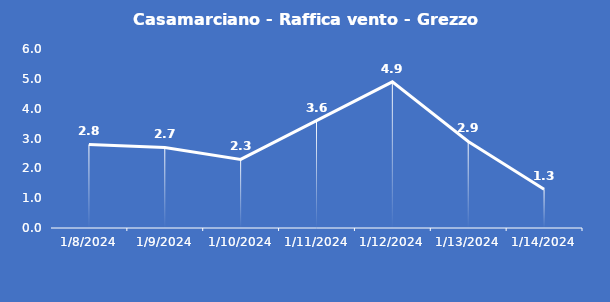
| Category | Casamarciano - Raffica vento - Grezzo (m/s) |
|---|---|
| 1/8/24 | 2.8 |
| 1/9/24 | 2.7 |
| 1/10/24 | 2.3 |
| 1/11/24 | 3.6 |
| 1/12/24 | 4.9 |
| 1/13/24 | 2.9 |
| 1/14/24 | 1.3 |